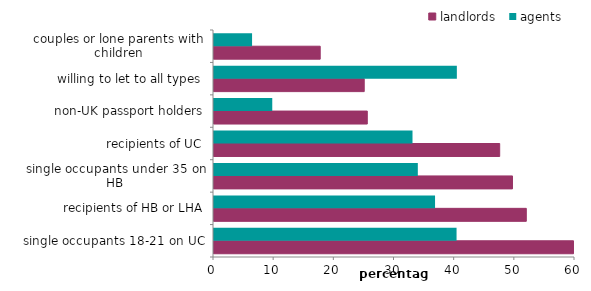
| Category | landlords | agents |
|---|---|---|
| single occupants 18-21 on UC | 59.749 | 40.315 |
| recipients of HB or LHA | 51.907 | 36.739 |
| single occupants under 35 on HB | 49.608 | 33.876 |
| recipients of UC | 47.484 | 32.992 |
| non-UK passport holders | 25.476 | 9.684 |
| willing to let to all types | 24.968 | 40.364 |
| couples or lone parents with children | 17.652 | 6.327 |